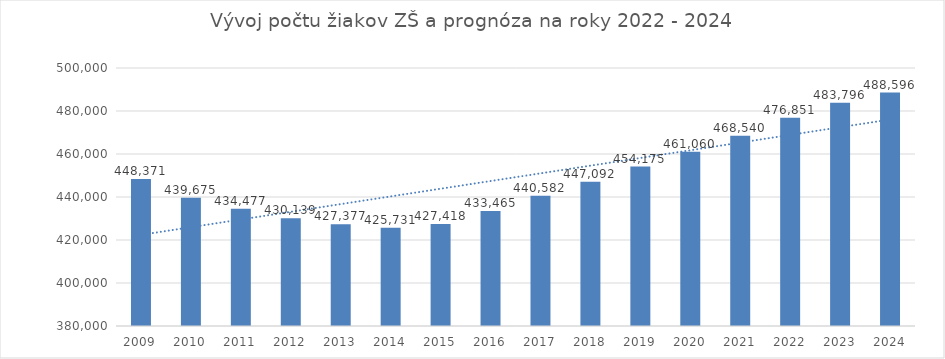
| Category | Základná škola |
|---|---|
| 2009.0 | 448371 |
| 2010.0 | 439675 |
| 2011.0 | 434477 |
| 2012.0 | 430139 |
| 2013.0 | 427377 |
| 2014.0 | 425731 |
| 2015.0 | 427418 |
| 2016.0 | 433465 |
| 2017.0 | 440582 |
| 2018.0 | 447092 |
| 2019.0 | 454175 |
| 2020.0 | 461060 |
| 2021.0 | 468540 |
| 2022.0 | 476851 |
| 2023.0 | 483796 |
| 2024.0 | 488596 |